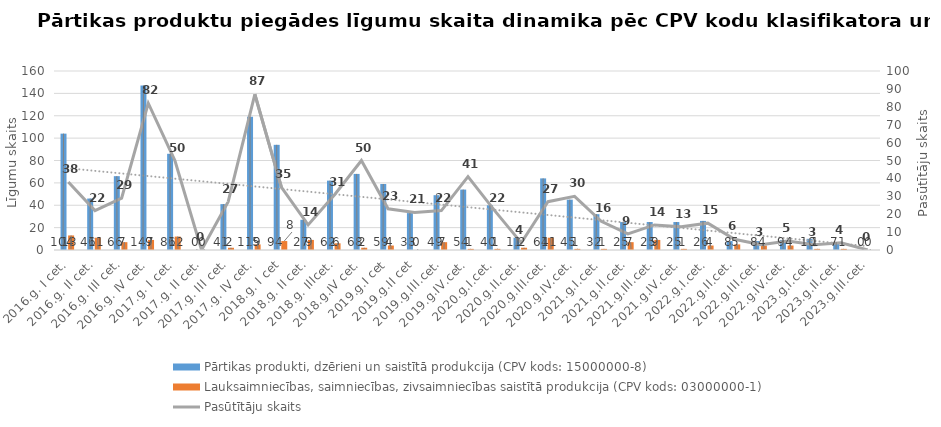
| Category | Pārtikas produkti, dzērieni un saistītā produkcija (CPV kods: 15000000-8) | Lauksaimniecības, saimniecības, zivsaimniecības saistītā produkcija (CPV kods: 03000000-1) |
|---|---|---|
| 2016.g. I cet. | 104 | 13 |
| 2016.g. II cet. | 46 | 11 |
| 2016.g. III cet. | 66 | 7 |
| 2016.g. IV cet. | 147 | 9 |
| 2017.g. I cet. | 86 | 12 |
| 2017.g. II cet. | 0 | 0 |
| 2017.g. III cet. | 41 | 2 |
| 2017.g. IV cet. | 119 | 5 |
| 2018.g. I cet | 94 | 8 |
| 2018.g. II cet. | 27 | 9 |
| 2018.g. IIIcet. | 62 | 6 |
| 2018.g.IV cet. | 68 | 2 |
| 2019.g.I cet | 59 | 4 |
| 2019.g.II cet | 33 | 0 |
| 2019.g.III.cet. | 49 | 7 |
| 2019.g.IV.cet. | 54 | 1 |
| 2020.g.I.cet. | 40 | 1 |
| 2020.g.II.cet. | 11 | 2 |
| 2020.g.III.cet. | 64 | 11 |
| 2020.g.IV.cet. | 45 | 1 |
| 2021.g.I.cet. | 32 | 1 |
| 2021.g.II.cet. | 25 | 7 |
| 2021.g.III.cet. | 25 | 9 |
| 2021.g.IV.cet. | 25 | 1 |
| 2022.g.I.cet. | 26 | 4 |
| 2022.g.II.cet. | 8 | 5 |
| 2022.g.III.cet. | 8 | 4 |
| 2022.g.IV.cet. | 9 | 4 |
| 2023.g.I.cet. | 10 | 1 |
| 2023.g.II.cet. | 7 | 1 |
| 2023.g.III.cet. | 0 | 0 |